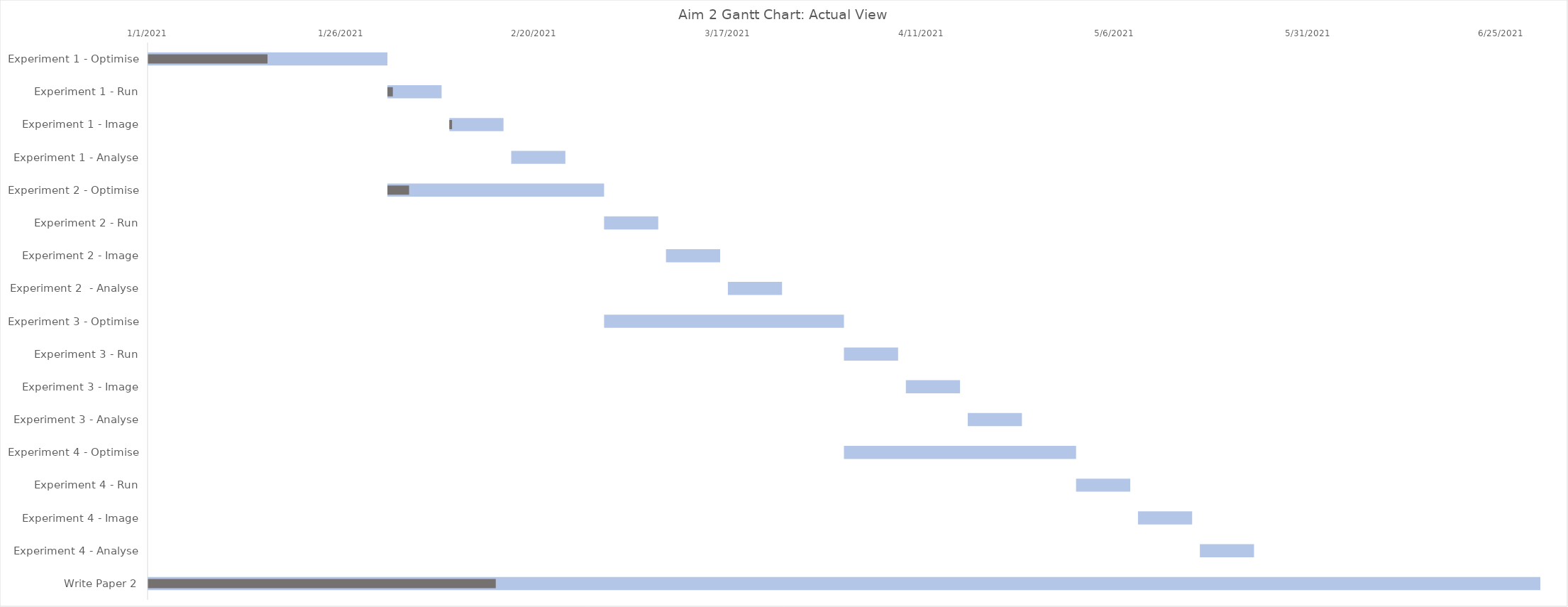
| Category | Start Date | # Days |
|---|---|---|
| Experiment 1 - Optimise | 1/1/21 | 31 |
| Experiment 1 - Run | 2/1/21 | 7 |
| Experiment 1 - Image | 2/9/21 | 7 |
| Experiment 1 - Analyse | 2/17/21 | 7 |
| Experiment 2 - Optimise | 2/1/21 | 28 |
| Experiment 2 - Run | 3/1/21 | 7 |
| Experiment 2 - Image | 3/9/21 | 7 |
| Experiment 2  - Analyse | 3/17/21 | 7 |
| Experiment 3 - Optimise | 3/1/21 | 31 |
| Experiment 3 - Run | 4/1/21 | 7 |
| Experiment 3 - Image | 4/9/21 | 7 |
| Experiment 3 - Analyse | 4/17/21 | 7 |
| Experiment 4 - Optimise | 4/1/21 | 30 |
| Experiment 4 - Run | 5/1/21 | 7 |
| Experiment 4 - Image | 5/9/21 | 7 |
| Experiment 4 - Analyse | 5/17/21 | 7 |
| Write Paper 2 | 1/1/21 | 180 |